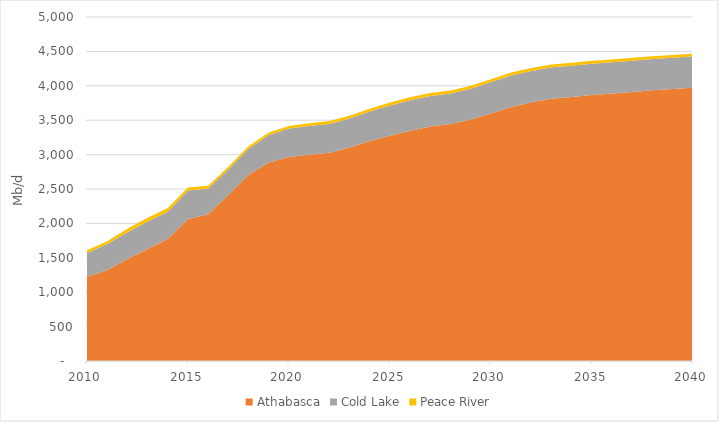
| Category | Athabasca | Cold Lake | Peace River |
|---|---|---|---|
| 2010.0 | 1228.983 | 340.211 | 40.191 |
| 2011.0 | 1318.349 | 380.676 | 40.851 |
| 2012.0 | 1482.227 | 390.289 | 49.656 |
| 2013.0 | 1626.919 | 401.623 | 53.616 |
| 2014.0 | 1773.708 | 394.793 | 54.327 |
| 2015.0 | 2065.117 | 411.649 | 46.498 |
| 2016.0 | 2134.558 | 374.17 | 39.523 |
| 2017.0 | 2411.84 | 372.799 | 37.787 |
| 2018.0 | 2706.783 | 378.715 | 37.012 |
| 2019.0 | 2884.841 | 398.835 | 36.796 |
| 2020.0 | 2964.871 | 414.573 | 37.8 |
| 2021.0 | 2996.574 | 419.082 | 39.636 |
| 2022.0 | 3025.938 | 420.275 | 41.539 |
| 2023.0 | 3102.562 | 420.87 | 42.261 |
| 2024.0 | 3197.945 | 426.943 | 42.698 |
| 2025.0 | 3273.75 | 441.11 | 42.894 |
| 2026.0 | 3346.195 | 444.167 | 42.883 |
| 2027.0 | 3408.016 | 444.167 | 42.873 |
| 2028.0 | 3445.031 | 444.167 | 42.863 |
| 2029.0 | 3510.95 | 447.604 | 42.853 |
| 2030.0 | 3597.963 | 455.739 | 42.783 |
| 2031.0 | 3692.717 | 457.29 | 42.705 |
| 2032.0 | 3759.694 | 457.087 | 42.627 |
| 2033.0 | 3811.707 | 456.707 | 42.488 |
| 2034.0 | 3836.976 | 456.131 | 42.282 |
| 2035.0 | 3866.422 | 455.533 | 42.069 |
| 2036.0 | 3886.874 | 454.934 | 41.856 |
| 2037.0 | 3911.572 | 454.338 | 41.644 |
| 2038.0 | 3935.411 | 453.745 | 41.433 |
| 2039.0 | 3954.465 | 453.155 | 41.224 |
| 2040.0 | 3973.658 | 452.569 | 41.015 |